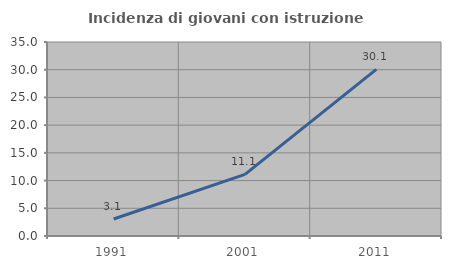
| Category | Incidenza di giovani con istruzione universitaria |
|---|---|
| 1991.0 | 3.061 |
| 2001.0 | 11.111 |
| 2011.0 | 30.061 |